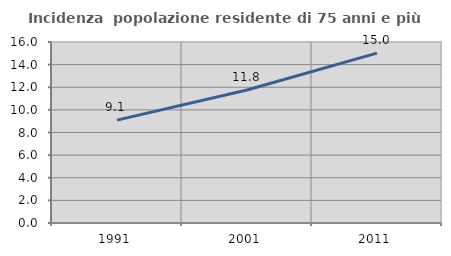
| Category | Incidenza  popolazione residente di 75 anni e più |
|---|---|
| 1991.0 | 9.091 |
| 2001.0 | 11.76 |
| 2011.0 | 15.022 |